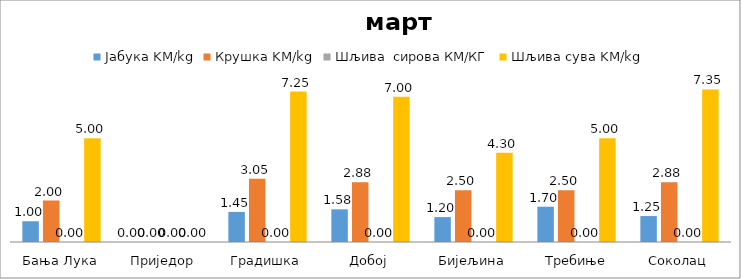
| Category | Јабука KM/kg | Крушка KM/kg | Шљива  сирова КМ/КГ | Шљива сува KM/kg |
|---|---|---|---|---|
| Бања Лука | 1 | 2 | 0 | 5 |
| Приједор | 0 | 0 | 0 | 0 |
| Градишка | 1.45 | 3.05 | 0 | 7.25 |
| Добој | 1.575 | 2.875 | 0 | 7 |
| Бијељина | 1.2 | 2.5 | 0 | 4.3 |
|  Требиње | 1.7 | 2.5 | 0 | 5 |
| Соколац | 1.25 | 2.875 | 0 | 7.35 |